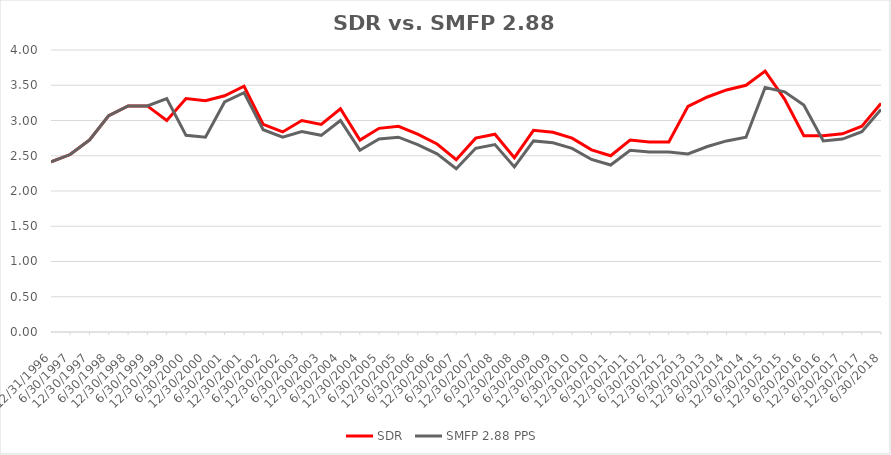
| Category | SDR | SMFP 2.88 PPS |
|---|---|---|
| 12/31/96 | 2.414 | 2.414 |
| 6/30/97 | 2.517 | 2.517 |
| 12/31/97 | 2.724 | 2.724 |
| 6/30/98 | 3.069 | 3.069 |
| 12/31/98 | 3.207 | 3.207 |
| 6/30/99 | 3.207 | 3.207 |
| 12/31/99 | 3 | 3.31 |
| 6/30/00 | 3.312 | 2.789 |
| 12/31/00 | 3.281 | 2.763 |
| 6/30/01 | 3.351 | 3.263 |
| 12/31/01 | 3.486 | 3.395 |
| 6/30/02 | 2.946 | 2.868 |
| 12/31/02 | 2.838 | 2.763 |
| 6/30/03 | 3 | 2.842 |
| 12/31/03 | 2.944 | 2.789 |
| 6/30/04 | 3.167 | 3 |
| 12/31/04 | 2.722 | 2.579 |
| 6/30/05 | 2.889 | 2.737 |
| 12/31/05 | 2.917 | 2.763 |
| 6/30/06 | 2.806 | 2.658 |
| 12/31/06 | 2.667 | 2.526 |
| 6/30/07 | 2.444 | 2.316 |
| 12/31/07 | 2.75 | 2.605 |
| 6/30/08 | 2.806 | 2.658 |
| 12/31/08 | 2.472 | 2.342 |
| 6/30/09 | 2.861 | 2.711 |
| 12/31/09 | 2.833 | 2.684 |
| 6/30/10 | 2.75 | 2.605 |
| 12/31/10 | 2.583 | 2.447 |
| 6/30/11 | 2.5 | 2.368 |
| 12/31/11 | 2.722 | 2.579 |
| 6/30/12 | 2.694 | 2.553 |
| 12/31/12 | 2.694 | 2.553 |
| 6/30/13 | 3.2 | 2.526 |
| 12/31/13 | 3.333 | 2.632 |
| 6/30/14 | 3.433 | 2.711 |
| 12/31/14 | 3.5 | 2.763 |
| 6/30/15 | 3.7 | 3.469 |
| 12/31/15 | 3.303 | 3.406 |
| 6/30/16 | 2.784 | 3.219 |
| 12/31/16 | 2.784 | 2.711 |
| 6/30/17 | 2.811 | 2.737 |
| 12/31/17 | 2.919 | 2.842 |
| 6/30/18 | 3.243 | 3.158 |